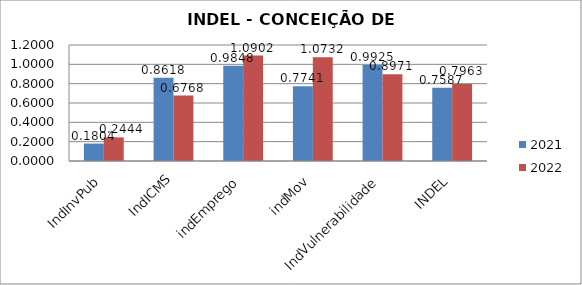
| Category | 2021 | 2022 |
|---|---|---|
| IndInvPub | 0.18 | 0.244 |
| IndICMS | 0.862 | 0.677 |
| indEmprego | 0.985 | 1.09 |
| indMov | 0.774 | 1.073 |
| IndVulnerabilidade | 0.992 | 0.897 |
| INDEL | 0.759 | 0.796 |